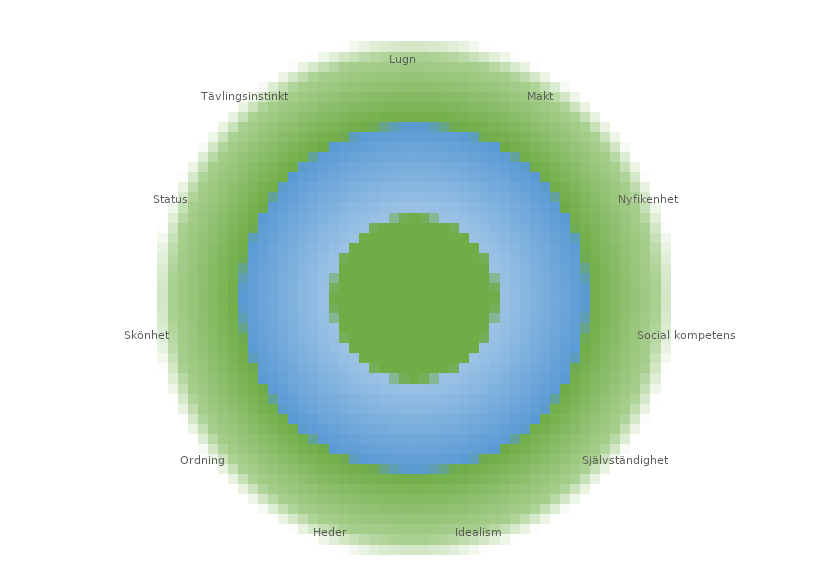
| Category | KA |
|---|---|
| Lugn | 0 |
| Makt | 0 |
| Nyfikenhet | 0 |
| Social kompetens | 0 |
| Självständighet | 0 |
| Idealism | 0 |
| Heder | 0 |
| Ordning | 0 |
| Skönhet | 0 |
| Status | 0 |
| Tävlingsinstinkt | 0 |